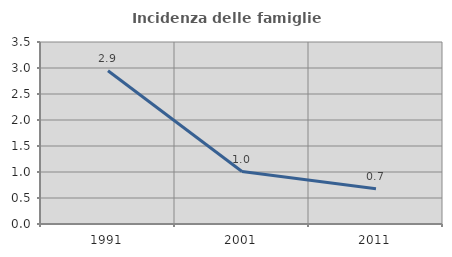
| Category | Incidenza delle famiglie numerose |
|---|---|
| 1991.0 | 2.948 |
| 2001.0 | 1.009 |
| 2011.0 | 0.676 |